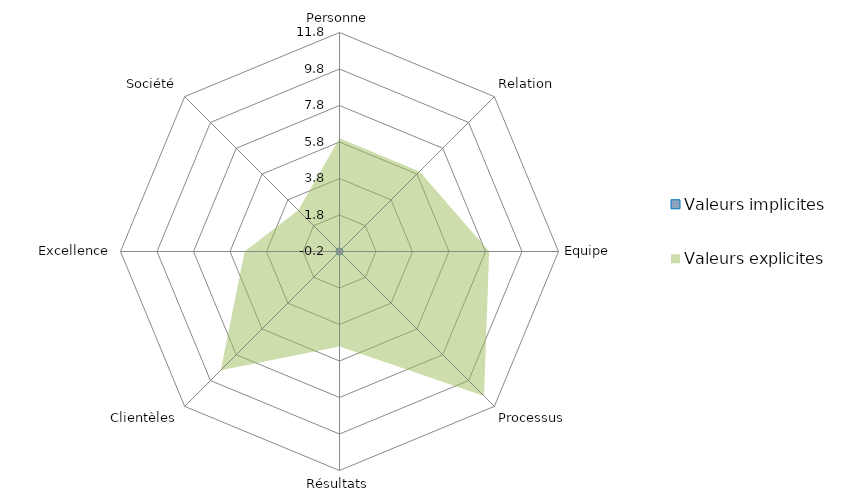
| Category | Valeurs implicites | Valeurs explicites |
|---|---|---|
| Personne | 0 | 6 |
| Relation | 0 | 6 |
| Equipe | 0 | 8 |
| Processus | 0 | 11 |
| Résultats | 0 | 5 |
| Clientèles | 0 | 9 |
| Excellence | 0 | 5 |
| Société | 0 | 3 |